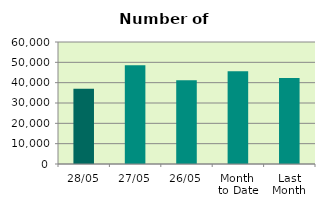
| Category | Series 0 |
|---|---|
| 28/05 | 36988 |
| 27/05 | 48592 |
| 26/05 | 41134 |
| Month 
to Date | 45555.1 |
| Last
Month | 42252.3 |